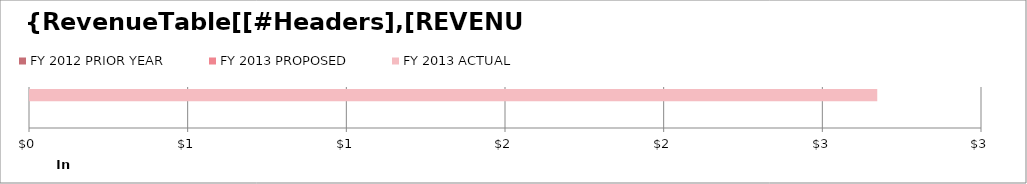
| Category | FY 2012 PRIOR YEAR | FY 2013 PROPOSED | FY 2013 ACTUAL |
|---|---|---|---|
| 0 | 0 | 0 | 2669.89 |